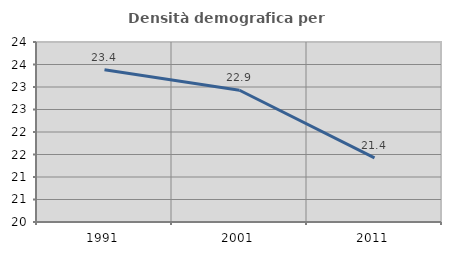
| Category | Densità demografica |
|---|---|
| 1991.0 | 23.386 |
| 2001.0 | 22.928 |
| 2011.0 | 21.423 |